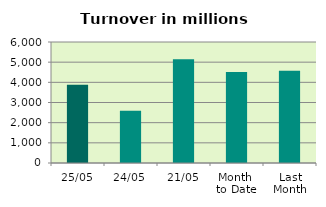
| Category | Series 0 |
|---|---|
| 25/05 | 3881.264 |
| 24/05 | 2590.56 |
| 21/05 | 5143.724 |
| Month 
to Date | 4506.345 |
| Last
Month | 4573.802 |